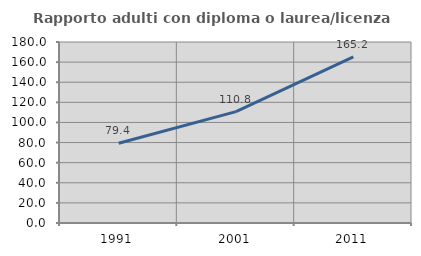
| Category | Rapporto adulti con diploma o laurea/licenza media  |
|---|---|
| 1991.0 | 79.379 |
| 2001.0 | 110.765 |
| 2011.0 | 165.195 |